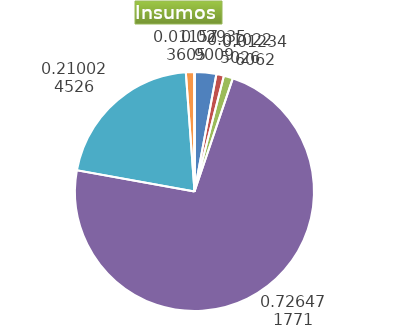
| Category | Series 0 |
|---|---|
| Control arvenses | 496690 |
| Control fitosanitario | 172985 |
| Cosecha y beneficio | 208868.28 |
| Fertilización | 12290308 |
| Instalación | 3553154.047 |
| Otros | 195800 |
| Podas | 0 |
| Riego | 0 |
| Transporte | 0 |
| Tutorado | 0 |